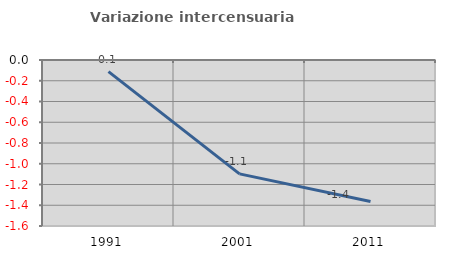
| Category | Variazione intercensuaria annua |
|---|---|
| 1991.0 | -0.112 |
| 2001.0 | -1.098 |
| 2011.0 | -1.364 |